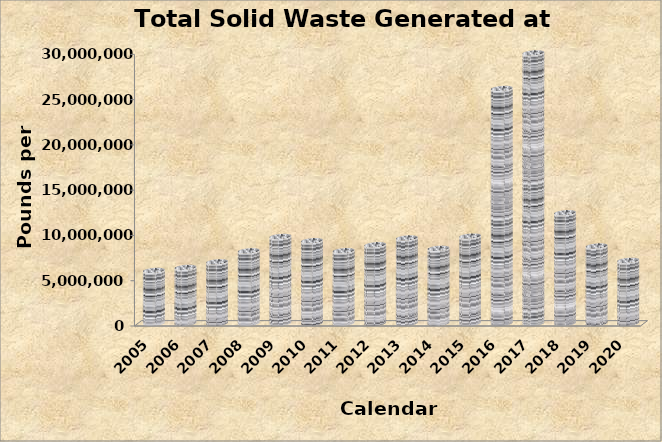
| Category | Calendar Year |
|---|---|
| 2020 | 6956862 |
| 2019 | 8541964.676 |
| 2018 | 12217590.46 |
| 2017 | 29868250.5 |
| 2016 | 25941496.47 |
| 2015 | 9632871 |
| 2014 | 8286081 |
| 2013 | 9431786 |
| 2012 | 8680436 |
| 2011 | 8023186 |
| 2010 | 9127127 |
| 2009 | 9594815 |
| 2008 | 8011387 |
| 2007 | 6796580 |
| 2006 | 6180709 |
| 2005 | 5841672 |